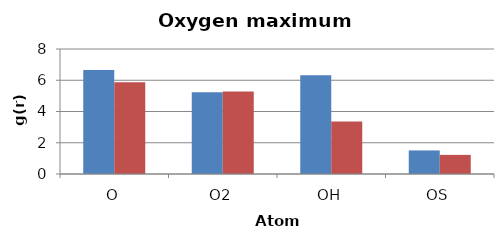
| Category | OW | HW |
|---|---|---|
| O | 6.658 | 5.876 |
| O2 | 5.237 | 5.282 |
| OH | 6.314 | 3.364 |
| OS | 1.508 | 1.224 |